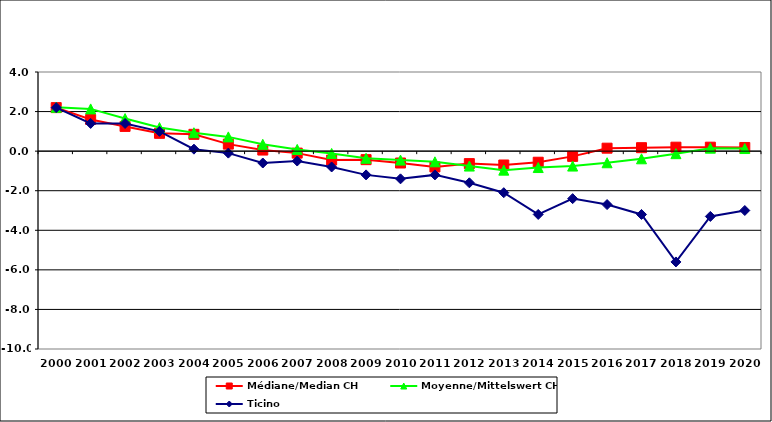
| Category | Médiane/Median CH | Moyenne/Mittelswert CH | Ticino |
|---|---|---|---|
| 2000.0 | 2.2 | 2.216 | 2.2 |
| 2001.0 | 1.6 | 2.135 | 1.4 |
| 2002.0 | 1.25 | 1.646 | 1.4 |
| 2003.0 | 0.9 | 1.191 | 1 |
| 2004.0 | 0.85 | 0.93 | 0.1 |
| 2005.0 | 0.355 | 0.72 | -0.1 |
| 2006.0 | 0.055 | 0.346 | -0.6 |
| 2007.0 | -0.1 | 0.087 | -0.5 |
| 2008.0 | -0.45 | -0.117 | -0.8 |
| 2009.0 | -0.43 | -0.362 | -1.2 |
| 2010.0 | -0.6 | -0.453 | -1.4 |
| 2011.0 | -0.8 | -0.54 | -1.2 |
| 2012.0 | -0.63 | -0.754 | -1.6 |
| 2013.0 | -0.7 | -0.96 | -2.1 |
| 2014.0 | -0.56 | -0.829 | -3.2 |
| 2015.0 | -0.265 | -0.755 | -2.4 |
| 2016.0 | 0.15 | -0.587 | -2.7 |
| 2017.0 | 0.175 | -0.387 | -3.2 |
| 2018.0 | 0.2 | -0.128 | -5.6 |
| 2019.0 | 0.2 | 0.151 | -3.3 |
| 2020.0 | 0.185 | 0.131 | -3 |